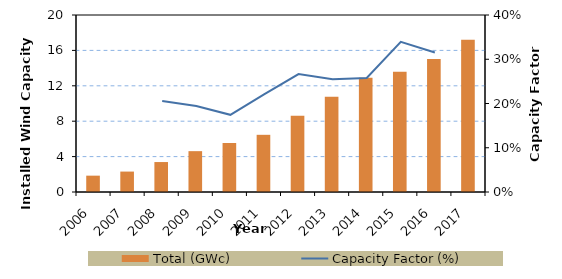
| Category | Total (GWc) |
|---|---|
| 2006.0 | 1.846 |
| 2007.0 | 2.308 |
| 2008.0 | 3.385 |
| 2009.0 | 4.615 |
| 2010.0 | 5.538 |
| 2011.0 | 6.462 |
| 2012.0 | 8.615 |
| 2013.0 | 10.769 |
| 2014.0 | 12.923 |
| 2015.0 | 13.599 |
| 2016.0 | 15.033 |
| 2017.0 | 17.2 |